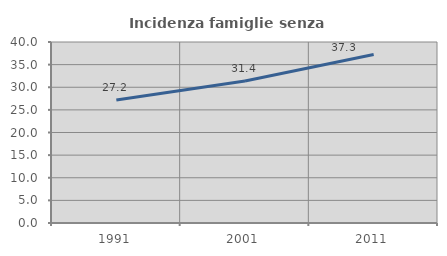
| Category | Incidenza famiglie senza nuclei |
|---|---|
| 1991.0 | 27.186 |
| 2001.0 | 31.377 |
| 2011.0 | 37.255 |